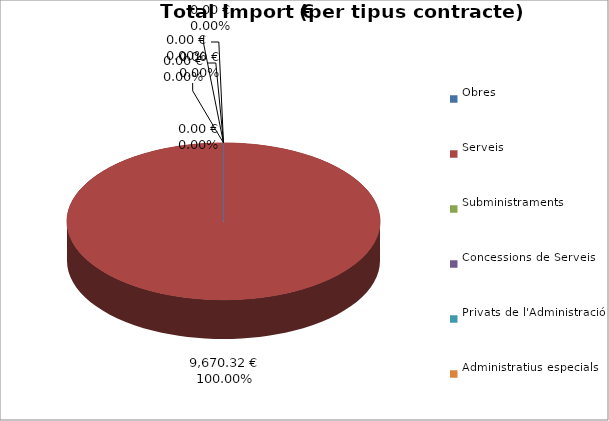
| Category | Total preu
(amb IVA) |
|---|---|
| Obres | 0 |
| Serveis | 9670.32 |
| Subministraments | 0 |
| Concessions de Serveis | 0 |
| Privats de l'Administració | 0 |
| Administratius especials | 0 |